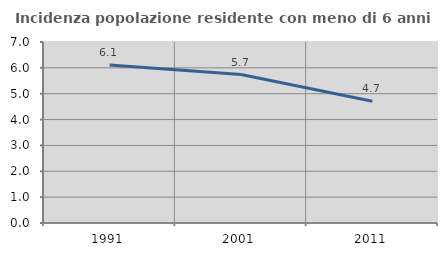
| Category | Incidenza popolazione residente con meno di 6 anni |
|---|---|
| 1991.0 | 6.111 |
| 2001.0 | 5.741 |
| 2011.0 | 4.71 |